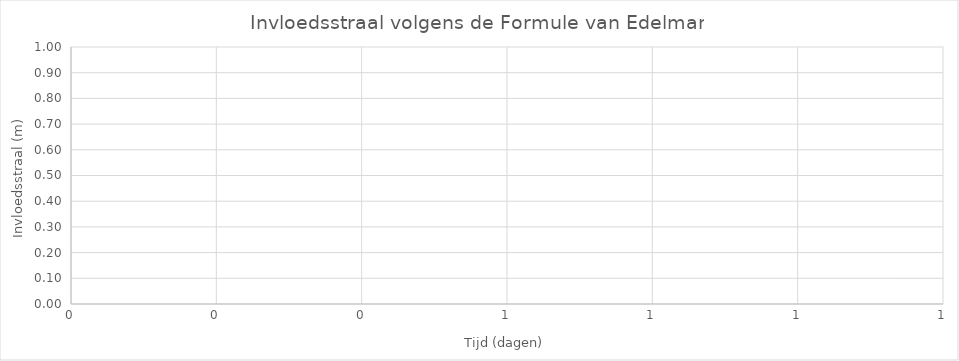
| Category | Invloedstraal |
|---|---|
| 1.0 | 0 |
| 1.0 | 0 |
| 1.0 | 0 |
| 1.0 | 0 |
| 1.0 | 0 |
| 1.0 | 0 |
| 1.0 | 0 |
| 1.0 | 0 |
| 1.0 | 0 |
| 1.0 | 0 |
| 1.0 | 0 |
| 1.0 | 0 |
| 1.0 | 0 |
| 1.0 | 0 |
| 1.0 | 0 |
| 1.0 | 0 |
| 1.0 | 0 |
| 1.0 | 0 |
| 1.0 | 0 |
| 1.0 | 0 |